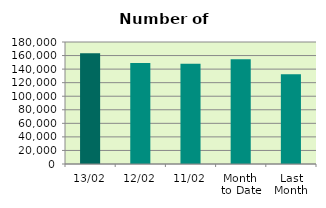
| Category | Series 0 |
|---|---|
| 13/02 | 163518 |
| 12/02 | 148972 |
| 11/02 | 147948 |
| Month 
to Date | 154732 |
| Last
Month | 132423.636 |